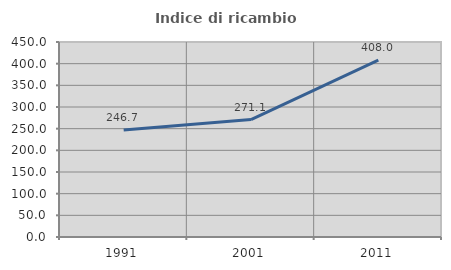
| Category | Indice di ricambio occupazionale  |
|---|---|
| 1991.0 | 246.667 |
| 2001.0 | 271.053 |
| 2011.0 | 408 |